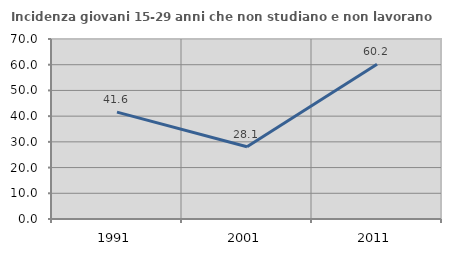
| Category | Incidenza giovani 15-29 anni che non studiano e non lavorano  |
|---|---|
| 1991.0 | 41.56 |
| 2001.0 | 28.099 |
| 2011.0 | 60.199 |